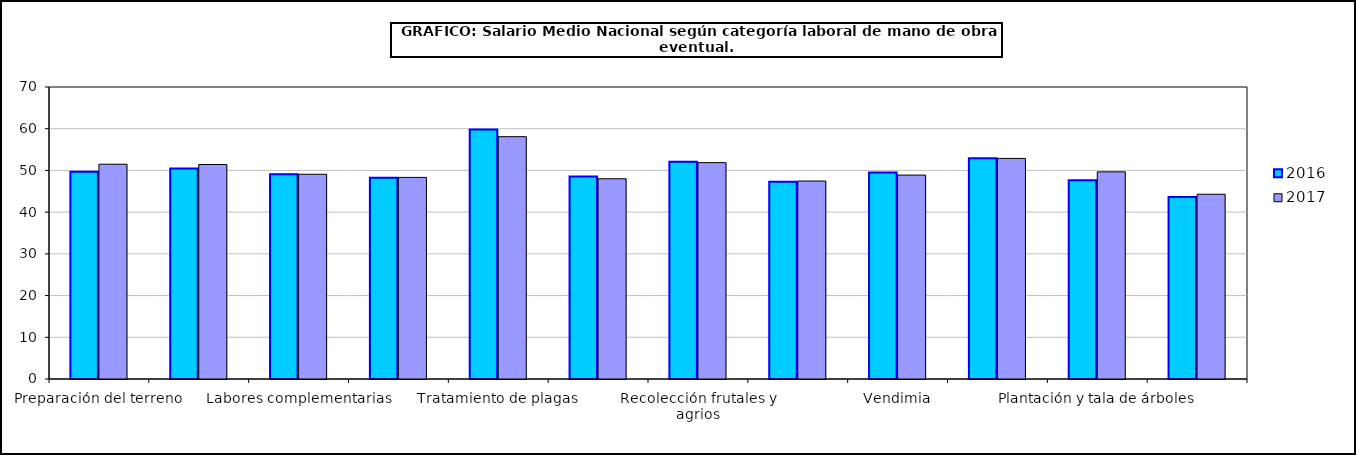
| Category | 2016 | 2017 |
|---|---|---|
| 0 |  | 51.49 |
| 1 |  | 51.42 |
| 2 |  | 49.08 |
| 3 |  | 48.33 |
| 4 |  | 58.09 |
| 5 |  | 48 |
| 6 |  | 51.87 |
| 7 |  | 47.46 |
| 8 |  | 48.88 |
| 9 |  | 52.88 |
| 10 |  | 49.66 |
| 11 |  | 44.29 |